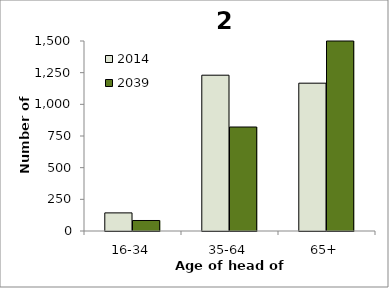
| Category | 2014 | 2039 |
|---|---|---|
| 16-34 | 143 | 83 |
| 35-64 | 1230 | 821 |
| 65+ | 1167 | 1659 |